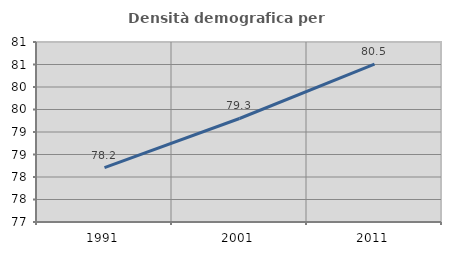
| Category | Densità demografica |
|---|---|
| 1991.0 | 78.21 |
| 2001.0 | 79.3 |
| 2011.0 | 80.507 |